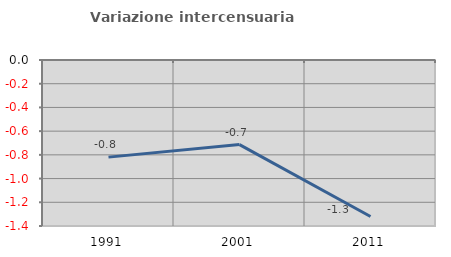
| Category | Variazione intercensuaria annua |
|---|---|
| 1991.0 | -0.819 |
| 2001.0 | -0.713 |
| 2011.0 | -1.32 |